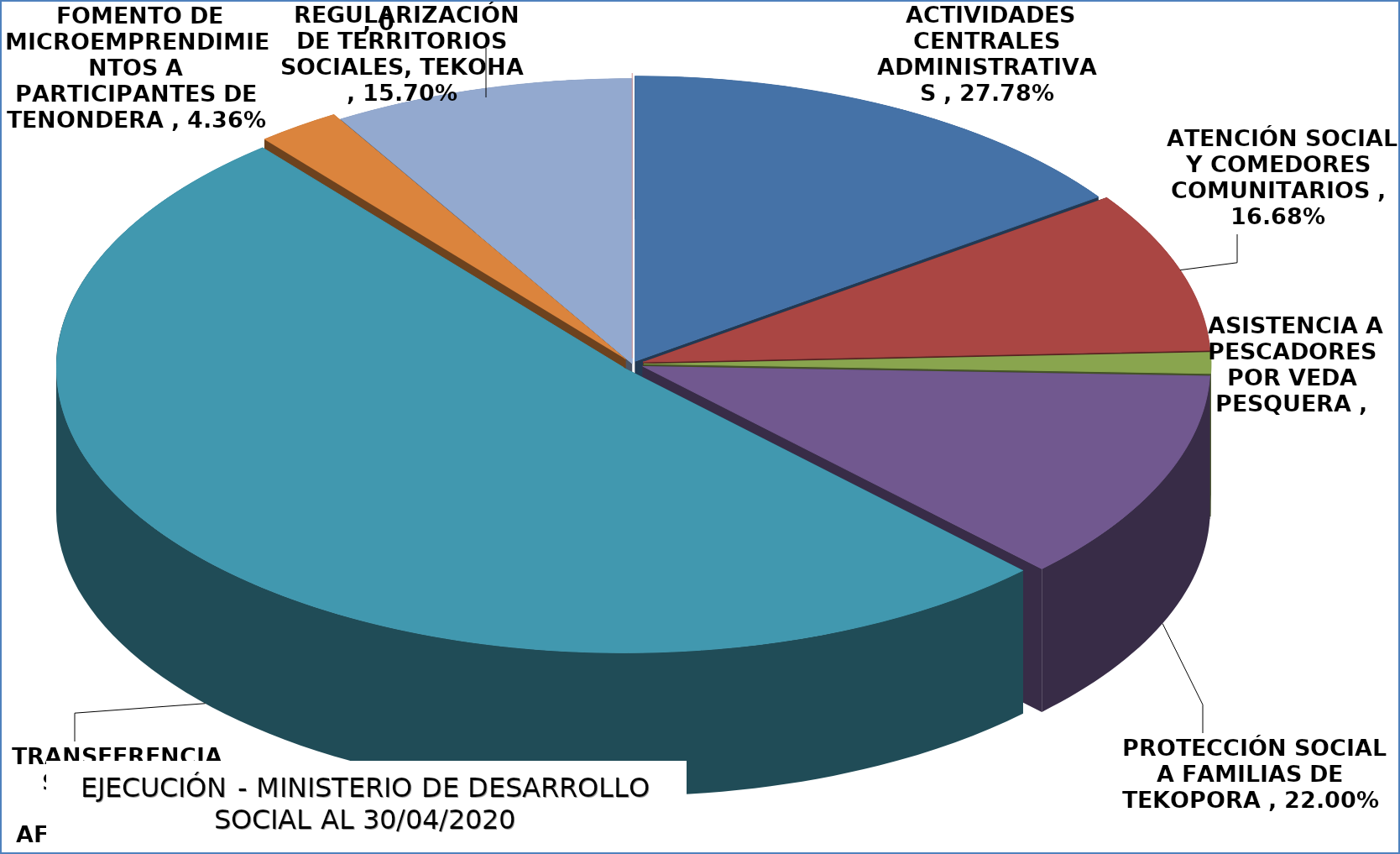
| Category | EJECUCIÓN - MINISTERIO DE DESARROLLO SOCIAL |
|---|---|
| ACTIVIDADES CENTRALES ADMINISTRATIVAS | 0.278 |
| ATENCIÓN SOCIAL Y COMEDORES COMUNITARIOS | 0.167 |
| ASISTENCIA A PESCADORES POR VEDA PESQUERA | 0.022 |
| PROTECCIÓN SOCIAL A FAMILIAS DE TEKOPORA | 0.22 |
| TRANSFERENCIAS MONET A FAMILIAS AFECTADS POR COVID-19 | 0.939 |
| FOMENTO DE MICROEMPRENDIMIENTOS A PARTICIPANTES DE TENONDERA | 0.044 |
| REGULARIZACIÓN DE TERRITORIOS SOCIALES, TEKOHA | 0.157 |